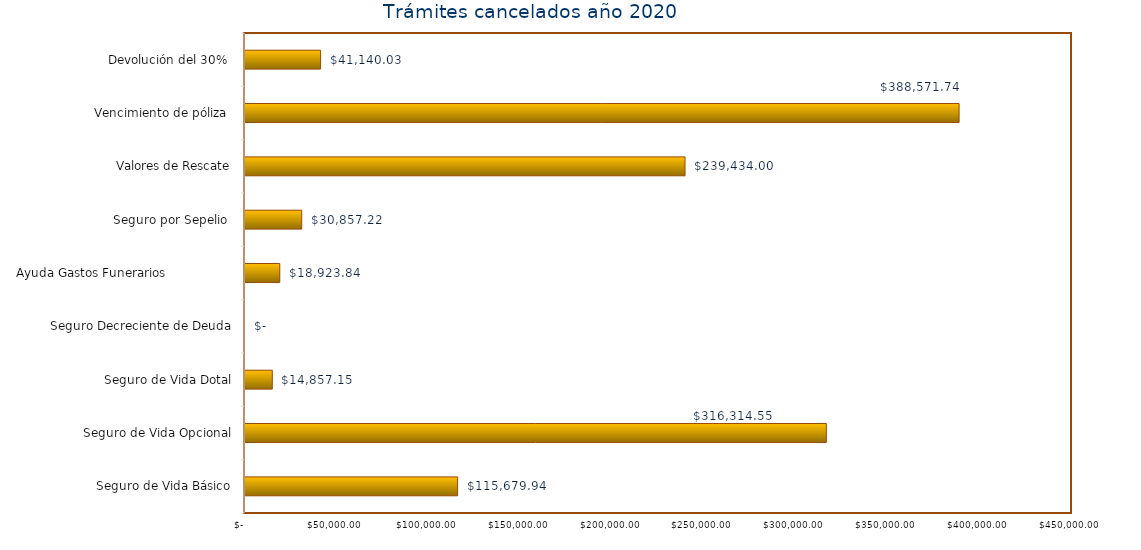
| Category | Monto  |
|---|---|
| Seguro de Vida Básico | 115679.94 |
| Seguro de Vida Opcional | 316314.55 |
| Seguro de Vida Dotal | 14857.15 |
| Seguro Decreciente de Deuda | 0 |
| Ayuda Gastos Funerarios                  | 18923.84 |
| Seguro por Sepelio  | 30857.22 |
| Valores de Rescate | 239434 |
| Vencimiento de póliza  | 388571.74 |
| Devolución del 30%  | 41140.03 |